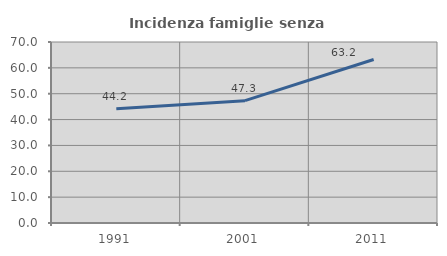
| Category | Incidenza famiglie senza nuclei |
|---|---|
| 1991.0 | 44.156 |
| 2001.0 | 47.321 |
| 2011.0 | 63.218 |